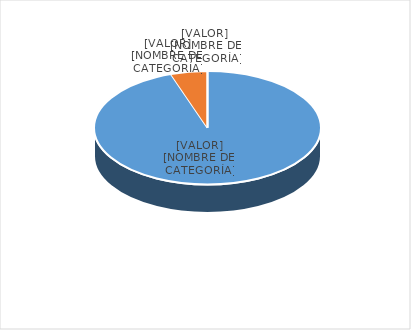
| Category | Series 0 |
|---|---|
| PRESUPUESTO VIGENTE PARA 2024 | 31000000 |
| PRESUPUESTO EJECUTADO  | 1713217.05 |
| PORCENTAJE DE EJECUCIÓN  | 0.055 |